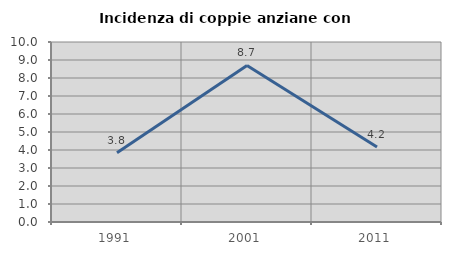
| Category | Incidenza di coppie anziane con figli |
|---|---|
| 1991.0 | 3.846 |
| 2001.0 | 8.696 |
| 2011.0 | 4.167 |